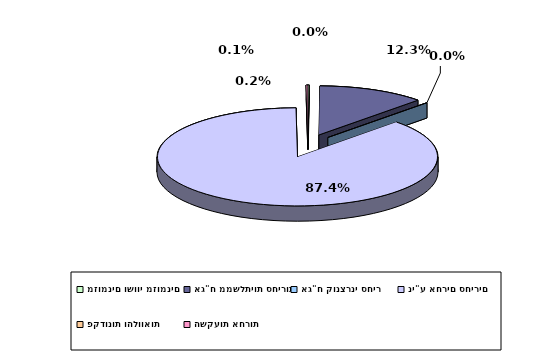
| Category | Series 0 |
|---|---|
| מזומנים ושווי מזומנים | 0.001 |
| אג"ח ממשלתיות סחירות | 0.123 |
| אג"ח קונצרני סחיר | 0 |
| ני"ע אחרים סחירים | 0.874 |
| פקדונות והלוואות | 0 |
| השקעות אחרות | 0.002 |